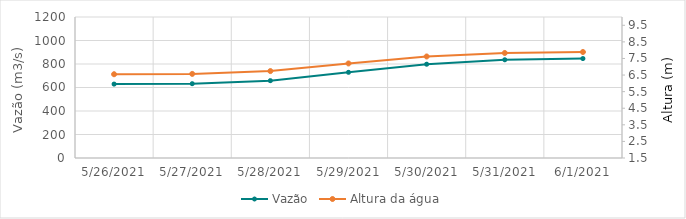
| Category | Vazão |
|---|---|
| 5/25/21 | 679.62 |
| 5/24/21 | 715.11 |
| 5/23/21 | 757.68 |
| 5/22/21 | 801.27 |
| 5/21/21 | 799.98 |
| 5/20/21 | 775.59 |
| 5/19/21 | 727.82 |